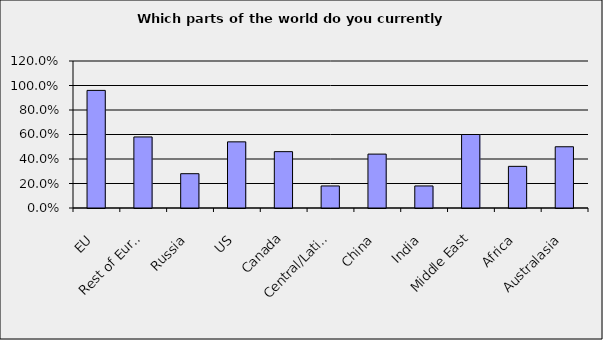
| Category | Series 0 |
|---|---|
| EU | 0.96 |
| Rest of Europe | 0.58 |
| Russia | 0.28 |
| US | 0.54 |
| Canada | 0.46 |
| Central/Latin America | 0.18 |
| China | 0.44 |
| India | 0.18 |
| Middle East | 0.6 |
| Africa | 0.34 |
| Australasia | 0.5 |